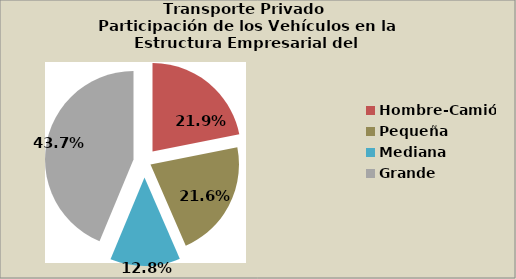
| Category | Series 0 |
|---|---|
| Hombre-Camión | 21.877 |
| Pequeña | 21.57 |
| Mediana | 12.792 |
| Grande | 43.7 |